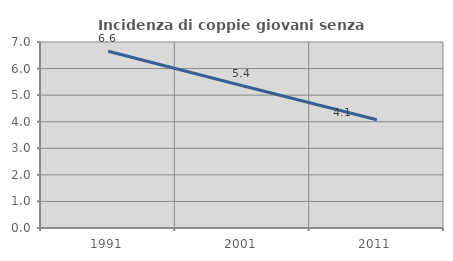
| Category | Incidenza di coppie giovani senza figli |
|---|---|
| 1991.0 | 6.649 |
| 2001.0 | 5.356 |
| 2011.0 | 4.073 |